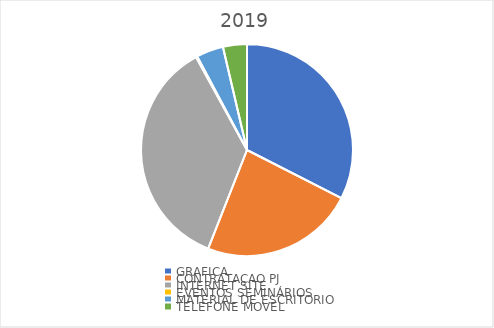
| Category | Series 0 |
|---|---|
| GRAFICA | 83108.4 |
| CONTRATAÇAO PJ | 60000 |
| INTERNET SITE | 92145.71 |
| EVENTOS SEMINÁRIOS | 500 |
| MATERIAL DE ESCRITORIO | 10568.5 |
| TELEFONE MOVEL | 9345.35 |